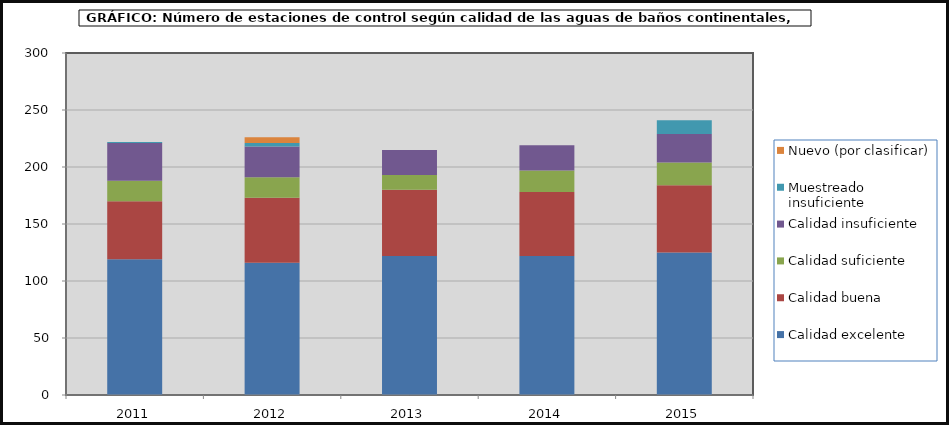
| Category | Calidad excelente | Calidad buena  | Calidad suficiente | Calidad insuficiente | Muestreado insuficiente | Nuevo (por clasificar) |
|---|---|---|---|---|---|---|
| 2011.0 | 119 | 51 | 18 | 33 | 1 | 0 |
| 2012.0 | 116 | 57 | 18 | 27 | 3 | 5 |
| 2013.0 | 122 | 58 | 13 | 22 | 0 | 0 |
| 2014.0 | 122 | 56 | 19 | 22 | 0 | 0 |
| 2015.0 | 125 | 59 | 20 | 25 | 12 | 0 |